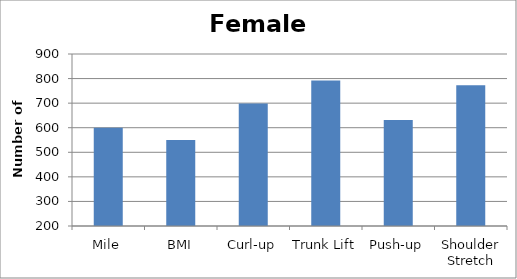
| Category | Pass |
|---|---|
| Mile | 600 |
| BMI | 550 |
| Curl-up | 699 |
| Trunk Lift | 792 |
| Push-up | 631 |
| Shoulder Stretch | 773 |